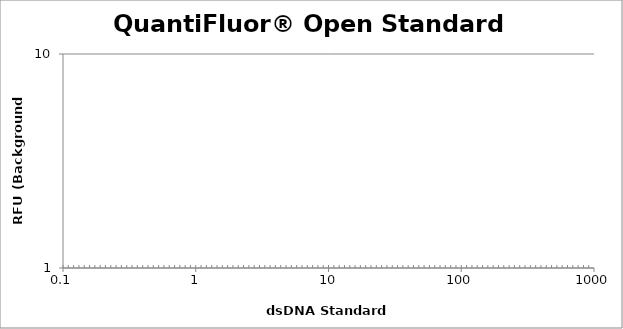
| Category | Average |
|---|---|
| 400.0 | 0 |
| 200.0 | 0 |
| 50.0 | 0 |
| 12.5 | 0 |
| 3.1 | 0 |
| 0.78 | 0 |
| 0.2 | 0 |